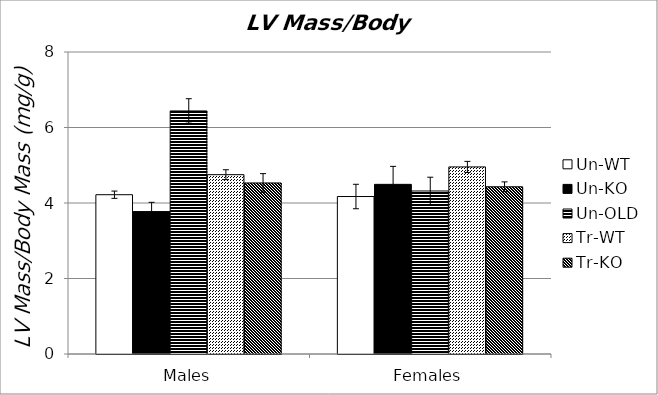
| Category | Un-WT | Un-KO | Un-OLD | Tr-WT | Tr-KO |
|---|---|---|---|---|---|
| 0 | 4.22 | 3.773 | 6.439 | 4.75 | 4.531 |
| 1 | 4.172 | 4.494 | 4.318 | 4.956 | 4.43 |